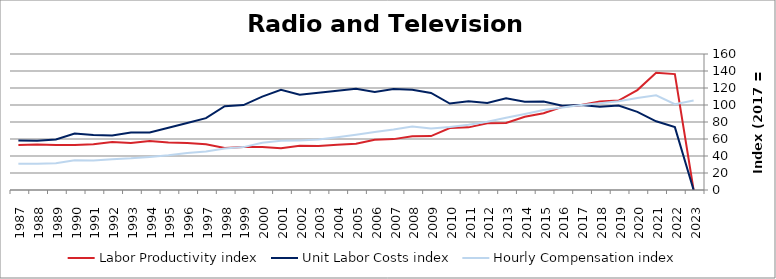
| Category | Labor Productivity index | Unit Labor Costs index | Hourly Compensation index |
|---|---|---|---|
| 2023.0 | 0 | 0 | 105.408 |
| 2022.0 | 136.335 | 73.974 | 100.852 |
| 2021.0 | 137.904 | 80.803 | 111.431 |
| 2020.0 | 117.562 | 91.99 | 108.145 |
| 2019.0 | 105.175 | 99.395 | 104.539 |
| 2018.0 | 104.038 | 98.085 | 102.046 |
| 2017.0 | 100 | 100 | 100 |
| 2016.0 | 97.923 | 99.026 | 96.97 |
| 2015.0 | 90.254 | 104.226 | 94.068 |
| 2014.0 | 86.218 | 103.81 | 89.503 |
| 2013.0 | 78.749 | 108.038 | 85.079 |
| 2012.0 | 78.53 | 102.343 | 80.37 |
| 2011.0 | 73.699 | 104.3 | 76.868 |
| 2010.0 | 72.824 | 101.704 | 74.065 |
| 2009.0 | 63.41 | 114.12 | 72.363 |
| 2008.0 | 63.232 | 118.043 | 74.641 |
| 2007.0 | 59.856 | 118.824 | 71.123 |
| 2006.0 | 59.08 | 115.388 | 68.172 |
| 2005.0 | 54.543 | 119.24 | 65.037 |
| 2004.0 | 53.163 | 116.785 | 62.086 |
| 2003.0 | 51.809 | 114.55 | 59.347 |
| 2002.0 | 52.12 | 111.962 | 58.355 |
| 2001.0 | 49.085 | 117.817 | 57.831 |
| 2000.0 | 50.649 | 109.864 | 55.645 |
| 1999.0 | 50.525 | 99.896 | 50.472 |
| 1998.0 | 49.495 | 98.543 | 48.774 |
| 1997.0 | 53.763 | 84.489 | 45.424 |
| 1996.0 | 55.311 | 78.814 | 43.593 |
| 1995.0 | 55.951 | 73.23 | 40.973 |
| 1994.0 | 57.603 | 67.584 | 38.93 |
| 1993.0 | 55.162 | 67.693 | 37.341 |
| 1992.0 | 56.437 | 64.239 | 36.254 |
| 1991.0 | 53.939 | 64.573 | 34.83 |
| 1990.0 | 52.864 | 66.439 | 35.122 |
| 1989.0 | 52.902 | 59.525 | 31.49 |
| 1988.0 | 53.448 | 57.929 | 30.962 |
| 1987.0 | 52.903 | 58.131 | 30.753 |